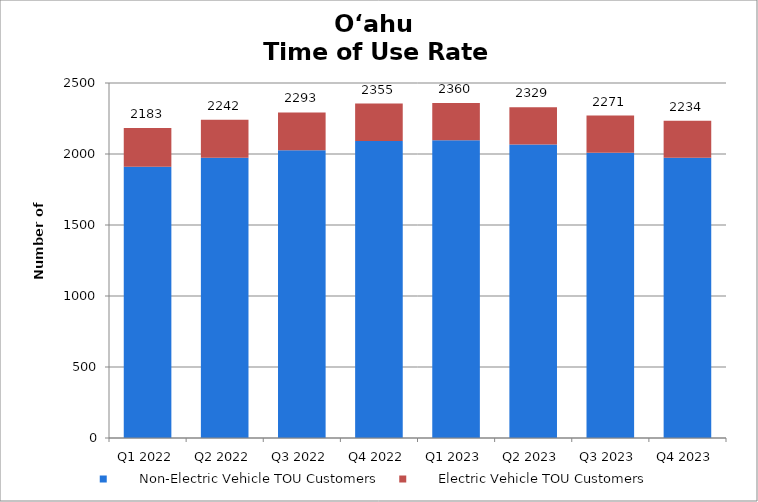
| Category |        Non-Electric Vehicle TOU Customers |        Electric Vehicle TOU Customers |
|---|---|---|
| Q1 2022 | 1911 | 272 |
| Q2 2022 | 1973 | 269 |
| Q3 2022 | 2026 | 267 |
| Q4 2022 | 2092 | 263 |
| Q1 2023 | 2097 | 263 |
| Q2 2023 | 2067 | 262 |
| Q3 2023 | 2008 | 263 |
| Q4 2023 | 1973 | 261 |